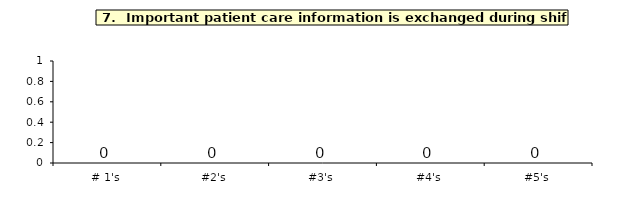
| Category | Q_7 |
|---|---|
| # 1's | 0 |
| #2's | 0 |
| #3's | 0 |
| #4's | 0 |
| #5's | 0 |